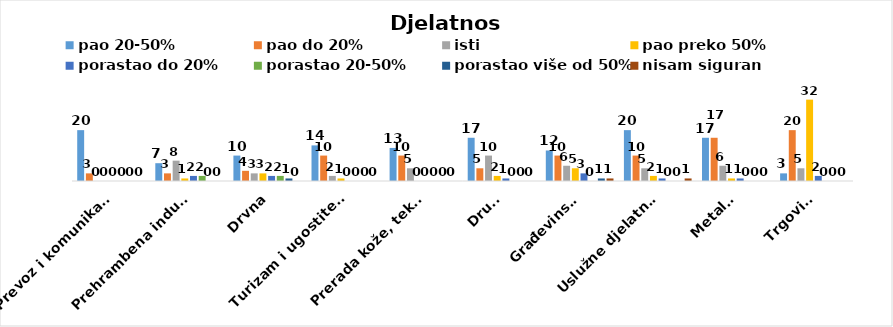
| Category | pao 20-50% | pao do 20% | isti | pao preko 50% | porastao do 20% | porastao 20-50% | porastao više od 50% | nisam siguran |
|---|---|---|---|---|---|---|---|---|
| Prevoz i komunikacije | 20 | 3 | 0 | 0 | 0 | 0 | 0 | 0 |
| Prehrambena industrija | 7 | 3 | 8 | 1 | 2 | 2 | 0 | 0 |
| Drvna | 10 | 4 | 3 | 3 | 2 | 2 | 1 | 0 |
| Turizam i ugostiteljstvo | 14 | 10 | 2 | 1 | 0 | 0 | 0 | 0 |
| Prerada kože, tekstila i obuće | 13 | 10 | 5 | 0 | 0 | 0 | 0 | 0 |
| Drugo | 17 | 5 | 10 | 2 | 1 | 0 | 0 | 0 |
| Građevinska | 12 | 10 | 6 | 5 | 3 | 0 | 1 | 1 |
| Uslužne djelatnosti | 20 | 10 | 5 | 2 | 1 | 0 | 0 | 1 |
| Metalna | 17 | 17 | 6 | 1 | 1 | 0 | 0 | 0 |
| Trgovina | 3 | 20 | 5 | 32 | 2 | 0 | 0 | 0 |